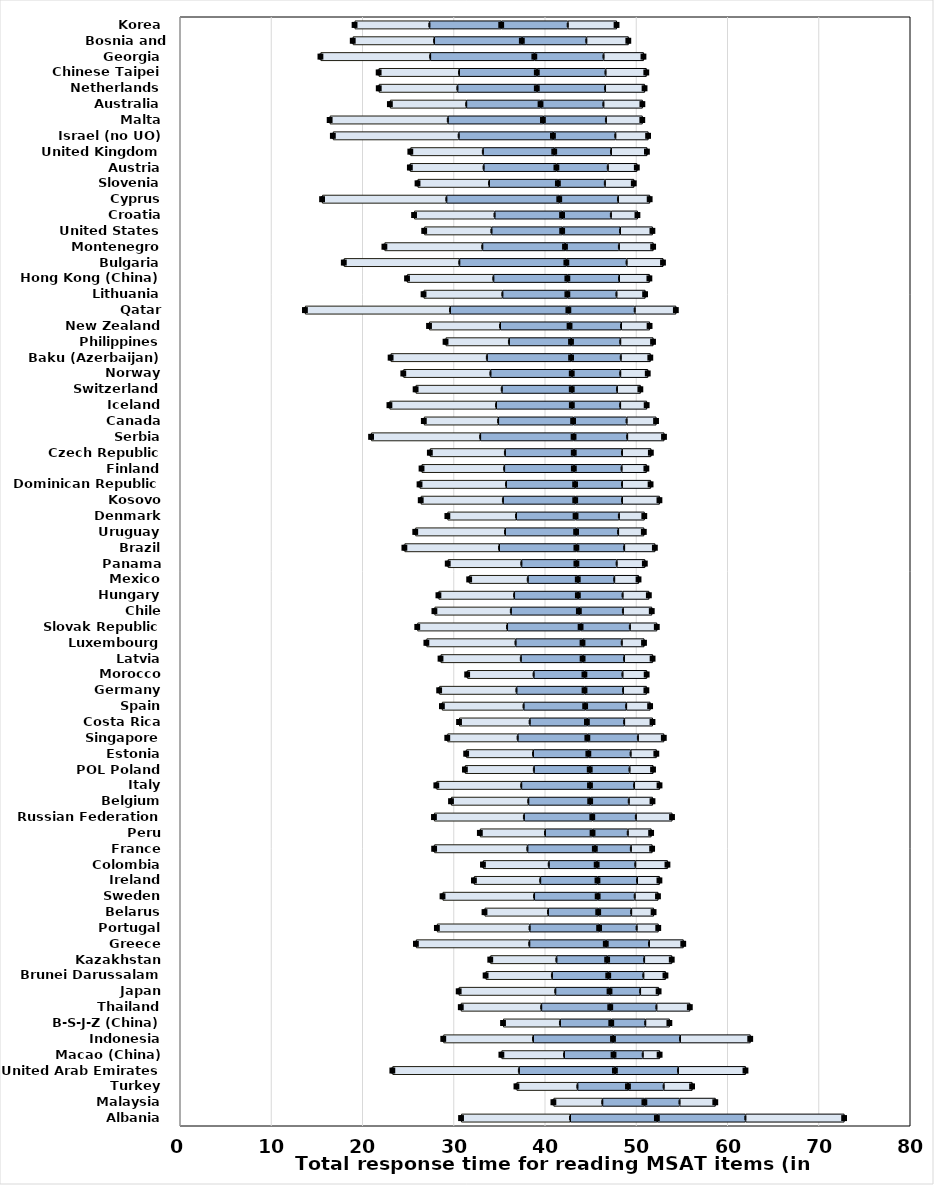
| Category | Q10 | Q25 | MEDIAN | Q75 | Q90 |
|---|---|---|---|---|---|
| Albania | 30.8 | 11.94 | 9.52 | 9.69 | 10.83 |
| Malaysia | 40.92 | 5.35 | 4.62 | 3.84 | 3.93 |
| Turkey | 36.87 | 6.67 | 5.55 | 3.9 | 3.13 |
| United Arab Emirates | 23.27 | 13.86 | 10.53 | 6.91 | 7.4 |
| Macao (China) | 35.22 | 6.86 | 5.43 | 3.19 | 1.86 |
| Indonesia | 28.85 | 9.83 | 8.77 | 7.34 | 7.7 |
| B-S-J-Z (China) | 35.4 | 6.23 | 5.63 | 3.72 | 2.65 |
| Thailand | 30.77 | 8.81 | 7.57 | 5.05 | 3.67 |
| Japan | 30.54 | 10.58 | 5.95 | 3.35 | 2.03 |
| Brunei Darussalam | 33.49 | 7.26 | 6.18 | 3.84 | 2.43 |
| Kazakhstan | 34 | 7.24 | 5.57 | 4.05 | 3.03 |
| Greece | 25.85 | 12.42 | 8.39 | 4.73 | 3.76 |
| Portugal | 28.15 | 10.15 | 7.63 | 4.1 | 2.38 |
| Belarus | 33.37 | 6.95 | 5.51 | 3.61 | 2.46 |
| Sweden | 28.77 | 10.03 | 6.97 | 4.05 | 2.56 |
| Ireland | 32.21 | 7.26 | 6.28 | 4.33 | 2.46 |
| Colombia | 33.2 | 7.2 | 5.26 | 4.23 | 3.53 |
| France | 27.85 | 10.21 | 7.4 | 3.94 | 2.34 |
| Peru | 32.86 | 7.13 | 5.22 | 3.85 | 2.57 |
| Russian Federation | 27.83 | 9.85 | 7.5 | 4.77 | 3.97 |
| Belgium | 29.7 | 8.46 | 6.79 | 4.22 | 2.61 |
| Italy | 28.09 | 9.3 | 7.54 | 4.83 | 2.79 |
| POL Poland | 31.22 | 7.55 | 6.13 | 4.35 | 2.59 |
| Estonia | 31.36 | 7.32 | 6.07 | 4.62 | 2.83 |
| Singapore | 29.29 | 7.7 | 7.65 | 5.53 | 2.85 |
| Costa Rica | 30.58 | 7.73 | 6.28 | 4.08 | 3.11 |
| Spain | 28.7 | 8.94 | 6.76 | 4.49 | 2.63 |
| Germany | 28.4 | 8.46 | 7.47 | 4.22 | 2.56 |
| Morocco | 31.47 | 7.27 | 5.58 | 4.16 | 2.66 |
| Latvia | 28.55 | 8.79 | 6.78 | 4.54 | 3.13 |
| Luxembourg | 27 | 9.76 | 7.35 | 4.29 | 2.45 |
| Slovak Republic | 26 | 9.84 | 8.06 | 5.39 | 2.96 |
| Chile | 27.88 | 8.37 | 7.46 | 4.82 | 3.17 |
| Hungary | 28.32 | 8.29 | 6.99 | 4.89 | 2.89 |
| Mexico | 31.69 | 6.41 | 5.49 | 3.99 | 2.67 |
| Panama | 29.34 | 8.06 | 6.04 | 4.4 | 3.1 |
| Brazil | 24.59 | 10.37 | 8.48 | 5.23 | 3.37 |
| Uruguay | 25.78 | 9.83 | 7.8 | 4.6 | 2.82 |
| Denmark | 29.3 | 7.52 | 6.53 | 4.74 | 2.79 |
| Kosovo | 26.38 | 9 | 7.93 | 5.13 | 4.1 |
| Dominican Republic | 26.25 | 9.47 | 7.58 | 5.13 | 3.14 |
| Finland | 26.47 | 9.05 | 7.64 | 5.22 | 2.73 |
| Czech Republic | 27.38 | 8.22 | 7.55 | 5.28 | 3.17 |
| Serbia | 20.94 | 11.95 | 10.24 | 5.87 | 4.04 |
| Canada | 26.72 | 8.14 | 8.22 | 5.85 | 3.24 |
| Iceland | 22.95 | 11.68 | 8.31 | 5.29 | 2.91 |
| Switzerland | 25.82 | 9.43 | 7.68 | 4.95 | 2.57 |
| Norway | 24.47 | 9.54 | 8.92 | 5.31 | 3.02 |
| Baku (Azerbaijan) | 23.08 | 10.54 | 9.24 | 5.43 | 3.25 |
| Philippines | 29.1 | 6.94 | 6.81 | 5.39 | 3.6 |
| New Zealand | 27.29 | 7.78 | 7.62 | 5.64 | 3.13 |
| Qatar | 13.69 | 15.89 | 12.98 | 7.26 | 4.52 |
| Lithuania | 26.69 | 8.63 | 7.13 | 5.37 | 3.15 |
| Hong Kong (China) | 24.88 | 9.45 | 8.12 | 5.66 | 3.33 |
| Bulgaria | 17.95 | 12.65 | 11.74 | 6.59 | 4 |
| Montenegro | 22.4 | 10.72 | 9.07 | 5.9 | 3.76 |
| United States | 26.76 | 7.36 | 7.76 | 6.34 | 3.55 |
| Croatia | 25.65 | 8.81 | 7.41 | 5.34 | 2.92 |
| Cyprus | 15.57 | 13.61 | 12.38 | 6.43 | 3.48 |
| Slovenia | 26.03 | 7.83 | 7.55 | 5.14 | 3.18 |
| Austria | 25.19 | 8.07 | 7.99 | 5.62 | 3.19 |
| United Kingdom | 25.24 | 7.94 | 7.83 | 6.22 | 3.94 |
| Israel (no UO) | 16.75 | 13.78 | 10.34 | 6.83 | 3.6 |
| Malta | 16.4 | 12.94 | 10.43 | 6.9 | 3.99 |
| Australia | 23 | 8.36 | 8.15 | 6.88 | 4.28 |
| Netherlands | 21.78 | 8.61 | 8.71 | 7.48 | 4.33 |
| Chinese Taipei | 21.77 | 8.8 | 8.53 | 7.52 | 4.48 |
| Georgia | 15.39 | 12.02 | 11.42 | 7.57 | 4.39 |
| Bosnia and Herzegovina | 18.93 | 8.91 | 9.62 | 7.06 | 4.61 |
| Korea | 19.13 | 8.19 | 7.88 | 7.28 | 5.36 |